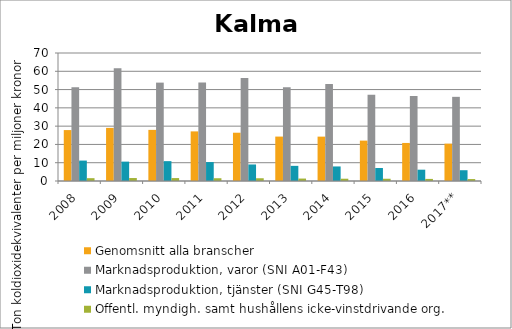
| Category | Genomsnitt alla branscher | Marknadsproduktion, varor (SNI A01-F43) | Marknadsproduktion, tjänster (SNI G45-T98) | Offentl. myndigh. samt hushållens icke-vinstdrivande org. |
|---|---|---|---|---|
| 2008 | 27.851 | 51.268 | 11.169 | 1.545 |
| 2009 | 29.044 | 61.719 | 10.595 | 1.621 |
| 2010 | 27.956 | 53.802 | 10.861 | 1.598 |
| 2011 | 27.133 | 53.873 | 10.361 | 1.51 |
| 2012 | 26.403 | 56.383 | 9.037 | 1.502 |
| 2013 | 24.291 | 51.332 | 8.283 | 1.337 |
| 2014 | 24.267 | 53.032 | 7.958 | 1.251 |
| 2015 | 22.088 | 47.191 | 7.101 | 1.234 |
| 2016 | 20.808 | 46.491 | 6.181 | 1.144 |
| 2017** | 20.43 | 46.025 | 5.9 | 1.06 |